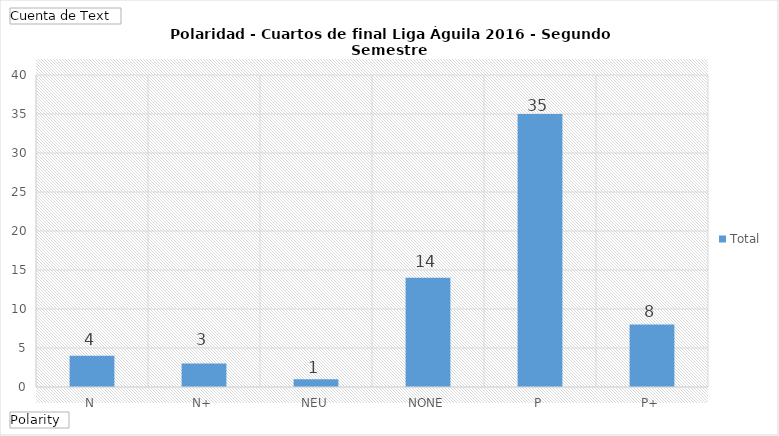
| Category | Total |
|---|---|
| N | 4 |
| N+ | 3 |
| NEU | 1 |
| NONE | 14 |
| P | 35 |
| P+ | 8 |